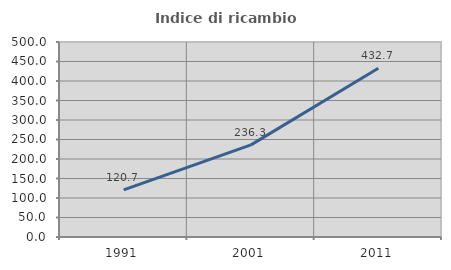
| Category | Indice di ricambio occupazionale  |
|---|---|
| 1991.0 | 120.739 |
| 2001.0 | 236.26 |
| 2011.0 | 432.71 |